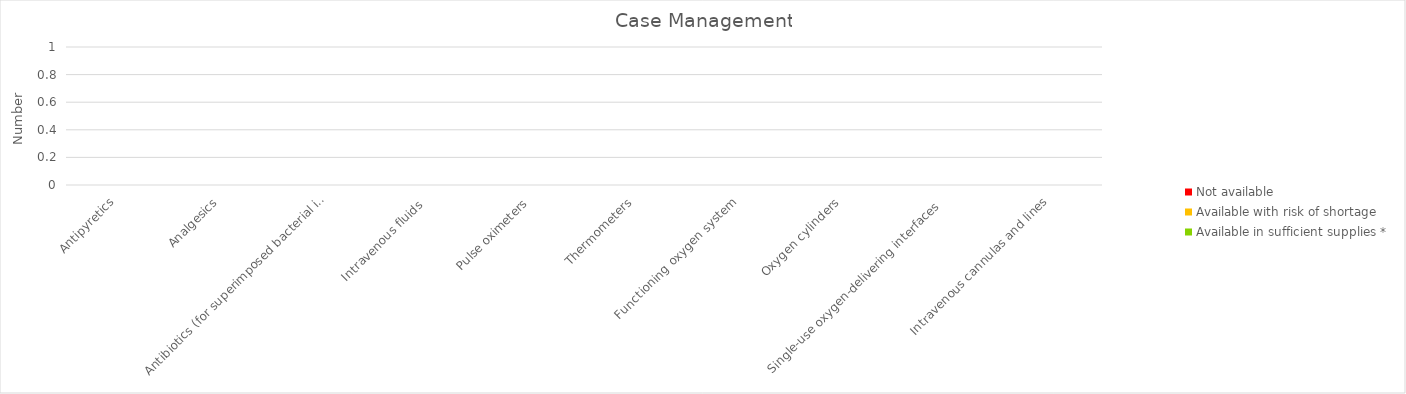
| Category | Available in sufficient supplies * | Available with risk of shortage | Not available |
|---|---|---|---|
| Antipyretics | 0 | 0 | 0 |
| Analgesics | 0 | 0 | 0 |
| Antibiotics (for superimposed bacterial infections) | 0 | 0 | 0 |
| Intravenous fluids  | 0 | 0 | 0 |
| Pulse oximeters | 0 | 0 | 0 |
| Thermometers | 0 | 0 | 0 |
| Functioning oxygen system | 0 | 0 | 0 |
| Oxygen cylinders | 0 | 0 | 0 |
| Single-use oxygen-delivering interfaces  | 0 | 0 | 0 |
| Intravenous cannulas and lines | 0 | 0 | 0 |